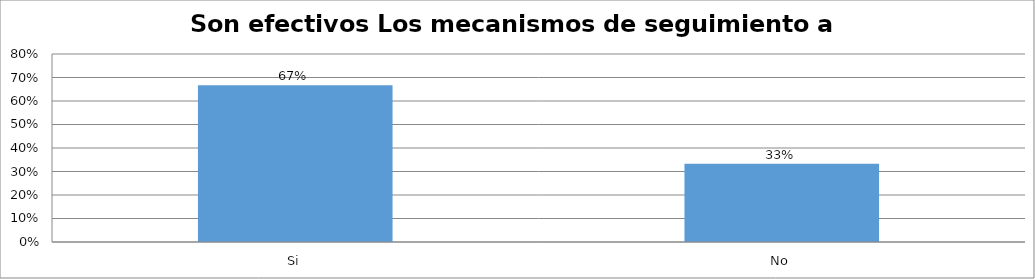
| Category | Series 0 |
|---|---|
| Si | 0.667 |
| No | 0.333 |